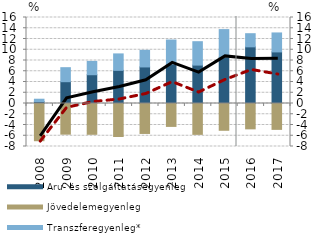
| Category | Áru- és szolgáltatásegyenleg | Jövedelemegyenleg | Transzferegyenleg* |
|---|---|---|---|
| 2008.0 | 0.359 | -6.923 | 0.437 |
| 2009.0 | 4.056 | -5.703 | 2.608 |
| 2010.0 | 5.354 | -5.729 | 2.482 |
| 2011.0 | 6.167 | -6.144 | 3.061 |
| 2012.0 | 6.802 | -5.573 | 3.091 |
| 2013.0 | 7.295 | -4.262 | 4.514 |
| 2014.0 | 7.145 | -5.741 | 4.354 |
| 2015.0 | 8.593 | -4.983 | 5.155 |
| 2016.0 | 10.54 | -4.718 | 2.447 |
| 2017.0 | 9.597 | -4.814 | 3.53 |